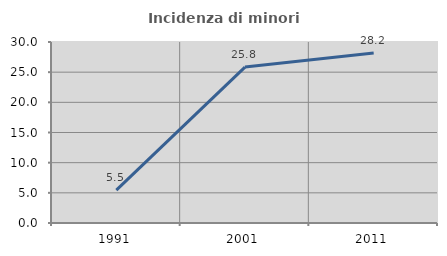
| Category | Incidenza di minori stranieri |
|---|---|
| 1991.0 | 5.455 |
| 2001.0 | 25.843 |
| 2011.0 | 28.166 |